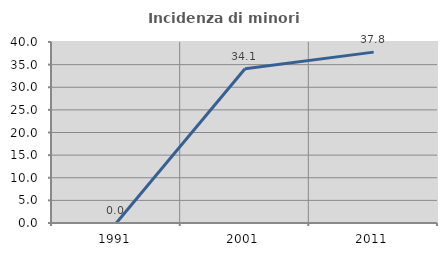
| Category | Incidenza di minori stranieri |
|---|---|
| 1991.0 | 0 |
| 2001.0 | 34.091 |
| 2011.0 | 37.762 |